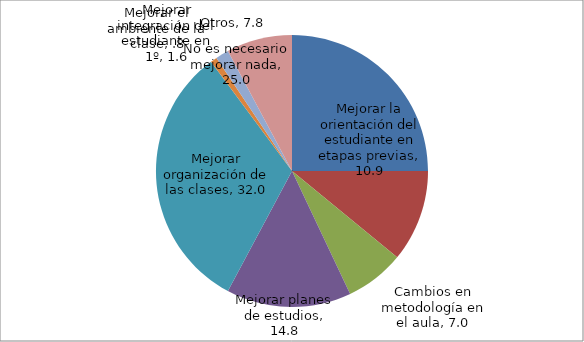
| Category | Series 0 |
|---|---|
| No es necesario mejorar nada | 25 |
| Mejorar la orientación del estudiante en etapas previas | 10.938 |
| Cambios en metodología en el aula | 7.031 |
| Mejorar planes de estudios | 14.844 |
| Mejorar organización de las clases | 32.031 |
| Mejorar el ambiente de la clase | 0.781 |
| Mejorar integración del estudiante en 1º | 1.562 |
| Otros | 7.812 |